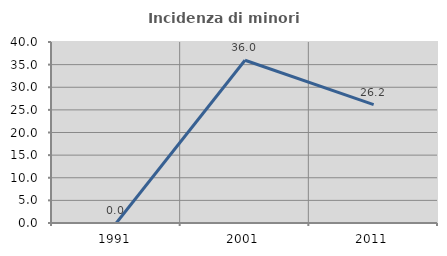
| Category | Incidenza di minori stranieri |
|---|---|
| 1991.0 | 0 |
| 2001.0 | 35.965 |
| 2011.0 | 26.154 |